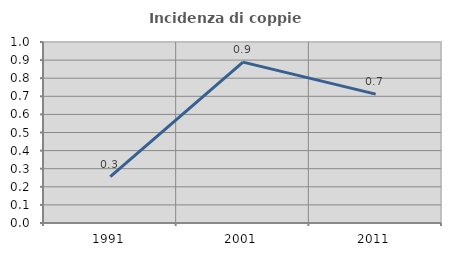
| Category | Incidenza di coppie miste |
|---|---|
| 1991.0 | 0.256 |
| 2001.0 | 0.889 |
| 2011.0 | 0.712 |